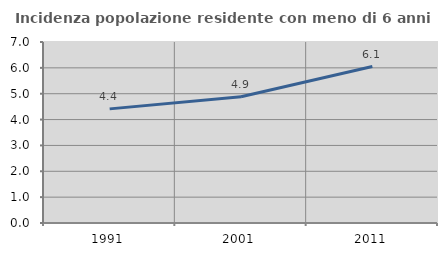
| Category | Incidenza popolazione residente con meno di 6 anni |
|---|---|
| 1991.0 | 4.413 |
| 2001.0 | 4.882 |
| 2011.0 | 6.05 |